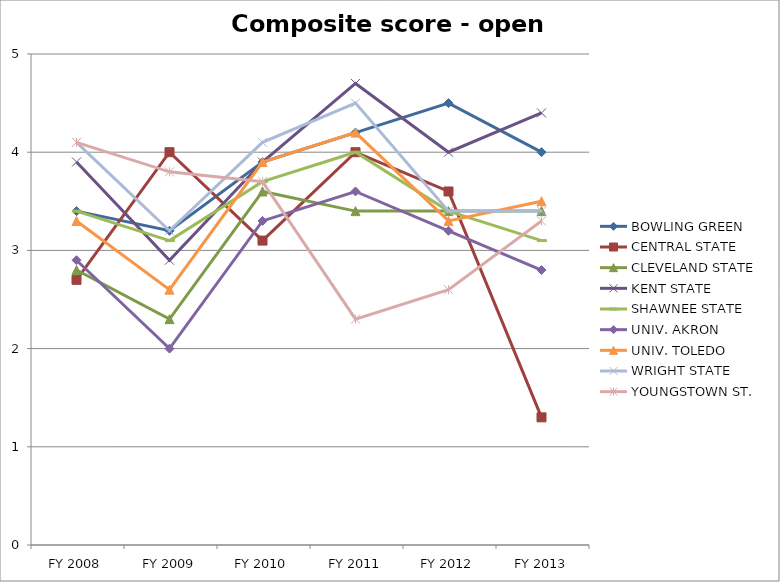
| Category | BOWLING GREEN  | CENTRAL STATE  | CLEVELAND STATE  | KENT STATE  | SHAWNEE STATE  | UNIV. AKRON  | UNIV. TOLEDO  | WRIGHT STATE  | YOUNGSTOWN ST.  |
|---|---|---|---|---|---|---|---|---|---|
| FY 2013 | 4 | 1.3 | 3.4 | 4.4 | 3.1 | 2.8 | 3.5 | 3.4 | 3.3 |
| FY 2012 | 4.5 | 3.6 | 3.4 | 4 | 3.4 | 3.2 | 3.3 | 3.4 | 2.6 |
| FY 2011 | 4.2 | 4 | 3.4 | 4.7 | 4 | 3.6 | 4.2 | 4.5 | 2.3 |
| FY 2010 | 3.9 | 3.1 | 3.6 | 3.9 | 3.7 | 3.3 | 3.9 | 4.1 | 3.7 |
| FY 2009 | 3.2 | 4 | 2.3 | 2.9 | 3.1 | 2 | 2.6 | 3.2 | 3.8 |
| FY 2008 | 3.4 | 2.7 | 2.8 | 3.9 | 3.4 | 2.9 | 3.3 | 4.1 | 4.1 |